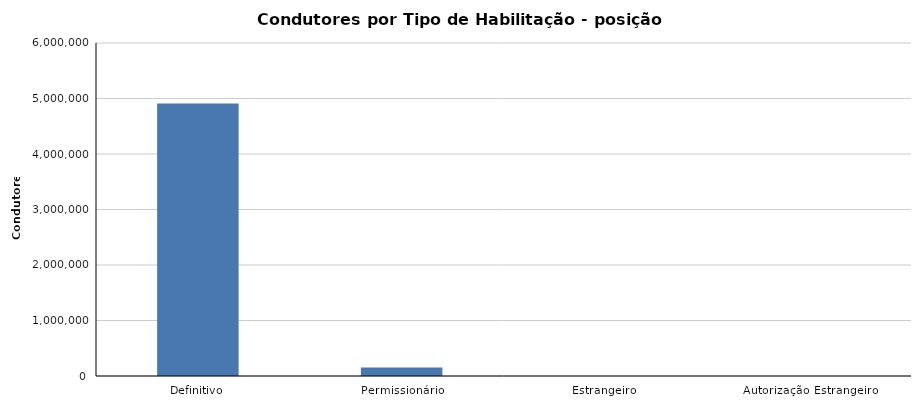
| Category | 2019/Dezembro |
|---|---|
| Definitivo | 4908871 |
| Permissionário | 152493 |
| Estrangeiro | 1 |
| Autorização Estrangeiro | 0 |